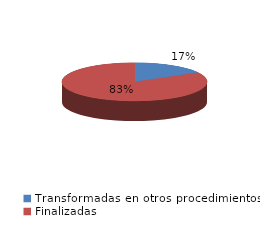
| Category | Series 0 |
|---|---|
| Transformadas en otros procedimientos | 2916 |
| Finalizadas | 14429 |